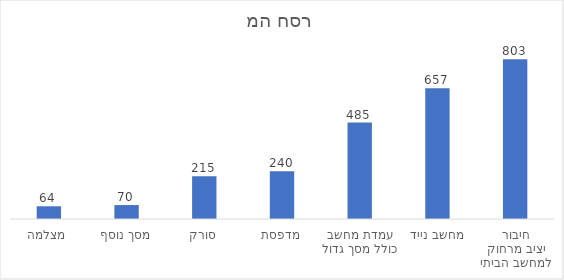
| Category | סה"כ |
|---|---|
| חיבור יציב מרחוק למחשב הביתי | 803 |
| מחשב נייד | 657 |
| עמדת מחשב כולל מסך גדול | 485 |
| מדפסת | 240 |
| סורק | 215 |
| מסך נוסף | 70 |
| מצלמה | 64 |